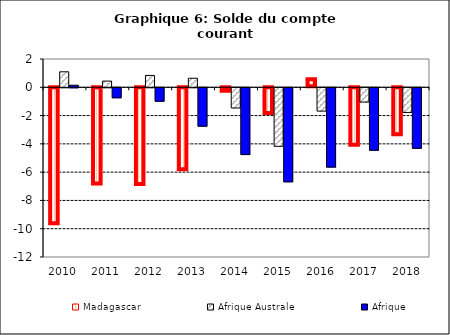
| Category | Madagascar | Afrique Australe | Afrique |
|---|---|---|---|
| 2010.0 | -9.685 | 1.095 | 0.144 |
| 2011.0 | -6.878 | 0.439 | -0.706 |
| 2012.0 | -6.907 | 0.839 | -0.95 |
| 2013.0 | -5.857 | 0.638 | -2.715 |
| 2014.0 | -0.315 | -1.429 | -4.722 |
| 2015.0 | -1.887 | -4.138 | -6.65 |
| 2016.0 | 0.57 | -1.65 | -5.608 |
| 2017.0 | -4.129 | -1.011 | -4.418 |
| 2018.0 | -3.387 | -1.744 | -4.278 |